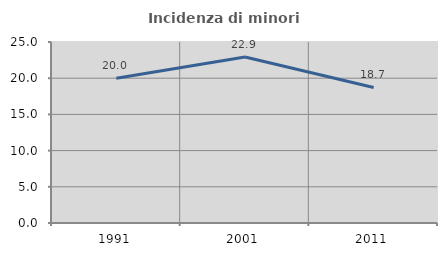
| Category | Incidenza di minori stranieri |
|---|---|
| 1991.0 | 20 |
| 2001.0 | 22.917 |
| 2011.0 | 18.721 |